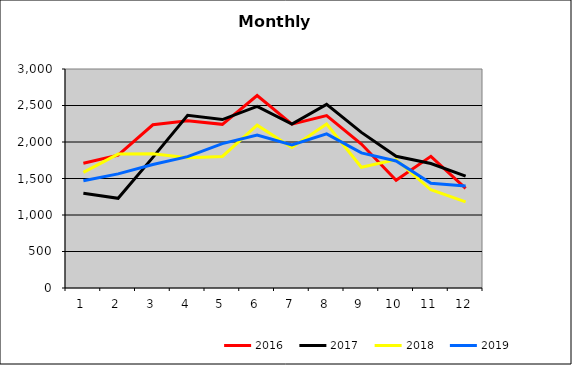
| Category | 2016 | 2017 | 2018 | 2019 |
|---|---|---|---|---|
| 0 | 1709.692 | 1297.347 | 1584.945 | 1467.961 |
| 1 | 1818.591 | 1228.546 | 1834.566 | 1563.301 |
| 2 | 2235.971 | 1789.782 | 1838.878 | 1692.17 |
| 3 | 2290.052 | 2364.914 | 1785.082 | 1799.954 |
| 4 | 2241.602 | 2307.576 | 1801.761 | 1977.85 |
| 5 | 2636.687 | 2488.575 | 2229.629 | 2096.552 |
| 6 | 2245.31 | 2244.746 | 1923.685 | 1959.132 |
| 7 | 2362.2 | 2515.952 | 2246.519 | 2111.404 |
| 8 | 1971.49 | 2131.972 | 1654.017 | 1851.294 |
| 9 | 1477.1 | 1804.009 | 1760.102 | 1740.445 |
| 10 | 1802.993 | 1705.861 | 1345.712 | 1434.409 |
| 11 | 1366.089 | 1533.212 | 1179.594 | 1396.753 |